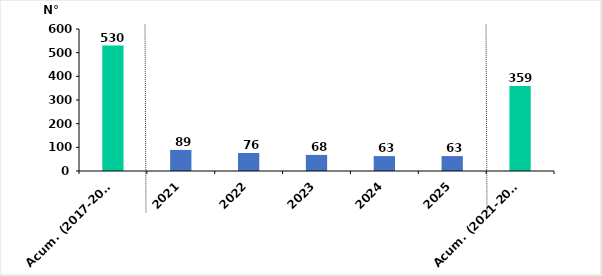
| Category | Series 0 |
|---|---|
| Acum. (2017-2020) | 530 |
| 2021 | 89 |
| 2022 | 76 |
| 2023 | 68 |
| 2024 | 63 |
| 2025 | 63 |
| Acum. (2021-2025) | 359 |